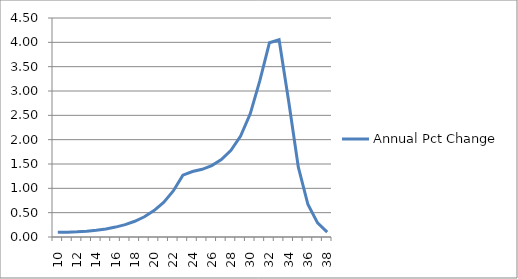
| Category | Annual Pct Change |
|---|---|
| 10.0 | 0.096 |
| 11.0 | 0.1 |
| 12.0 | 0.108 |
| 13.0 | 0.12 |
| 14.0 | 0.139 |
| 15.0 | 0.166 |
| 16.0 | 0.204 |
| 17.0 | 0.255 |
| 18.0 | 0.324 |
| 19.0 | 0.416 |
| 20.0 | 0.542 |
| 21.0 | 0.712 |
| 22.0 | 0.945 |
| 23.0 | 1.27 |
| 24.0 | 1.346 |
| 25.0 | 1.392 |
| 26.0 | 1.469 |
| 27.0 | 1.59 |
| 28.0 | 1.78 |
| 29.0 | 2.073 |
| 30.0 | 2.531 |
| 31.0 | 3.212 |
| 32.0 | 3.992 |
| 33.0 | 4.053 |
| 34.0 | 2.786 |
| 35.0 | 1.435 |
| 36.0 | 0.666 |
| 37.0 | 0.289 |
| 38.0 | 0.1 |